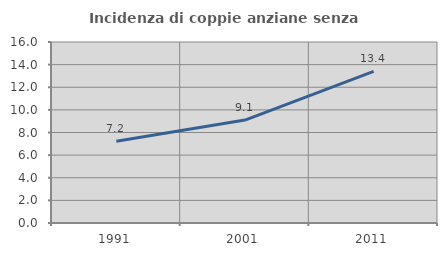
| Category | Incidenza di coppie anziane senza figli  |
|---|---|
| 1991.0 | 7.232 |
| 2001.0 | 9.099 |
| 2011.0 | 13.408 |